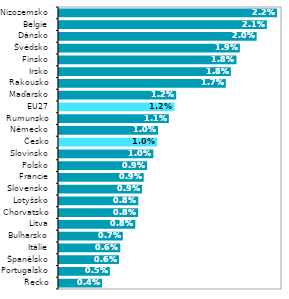
| Category | Series 0 |
|---|---|
| Řecko | 0.004 |
| Portugalsko | 0.005 |
| Španělsko | 0.006 |
| Itálie | 0.006 |
| Bulharsko | 0.007 |
| Litva | 0.008 |
| Chorvatsko | 0.008 |
| Lotyšsko | 0.008 |
| Slovensko | 0.009 |
| Francie | 0.009 |
| Polsko | 0.009 |
| Slovinsko | 0.01 |
| Česko | 0.01 |
| Německo | 0.01 |
| Rumunsko | 0.011 |
| EU27 | 0.012 |
| Maďarsko | 0.012 |
| Rakousko | 0.017 |
| Irsko | 0.018 |
| Finsko | 0.018 |
| Švédsko | 0.019 |
| Dánsko | 0.02 |
| Belgie | 0.021 |
| Nizozemsko | 0.022 |